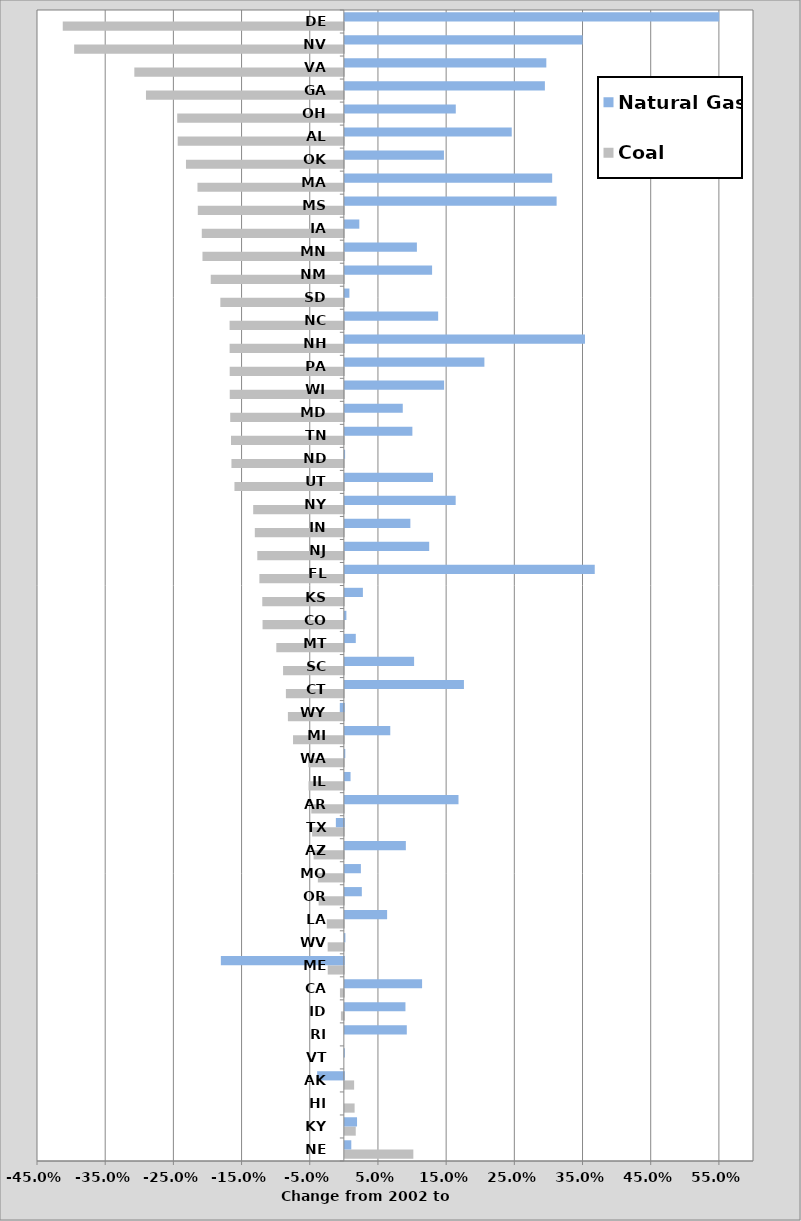
| Category | Coal | Natural Gas |
|---|---|---|
| NE | 0.1 | 0.009 |
| KY | 0.016 | 0.018 |
| HI | 0.014 | 0 |
| AK | 0.014 | -0.039 |
| VT | 0 | 0 |
| RI | 0 | 0.091 |
| ID | -0.004 | 0.089 |
| CA | -0.006 | 0.113 |
| ME | -0.024 | -0.18 |
| WV | -0.024 | 0.001 |
| LA | -0.025 | 0.062 |
| OR | -0.037 | 0.025 |
| MO | -0.038 | 0.024 |
| AZ | -0.044 | 0.089 |
| TX | -0.047 | -0.012 |
| AR | -0.048 | 0.167 |
| IL | -0.052 | 0.008 |
| WA | -0.052 | 0.001 |
| MI | -0.075 | 0.067 |
| WY | -0.082 | -0.006 |
| CT | -0.085 | 0.175 |
| SC | -0.089 | 0.102 |
| MT | -0.099 | 0.016 |
| CO | -0.119 | 0.002 |
| KS | -0.12 | 0.026 |
| FL | -0.124 | 0.366 |
| NJ | -0.127 | 0.124 |
| IN | -0.131 | 0.096 |
| NY | -0.133 | 0.163 |
| UT | -0.16 | 0.129 |
| ND | -0.165 | 0 |
| TN | -0.165 | 0.099 |
| MD | -0.167 | 0.085 |
| WI | -0.167 | 0.146 |
| PA | -0.167 | 0.205 |
| NH | -0.168 | 0.352 |
| NC | -0.168 | 0.137 |
| SD | -0.181 | 0.007 |
| NM | -0.195 | 0.128 |
| MN | -0.207 | 0.106 |
| IA | -0.208 | 0.021 |
| MS | -0.214 | 0.311 |
| MA | -0.215 | 0.304 |
| OK | -0.232 | 0.145 |
| AL | -0.244 | 0.245 |
| OH | -0.244 | 0.163 |
| GA | -0.29 | 0.293 |
| VA | -0.307 | 0.295 |
| NV | -0.396 | 0.349 |
| DE | -0.412 | 0.549 |